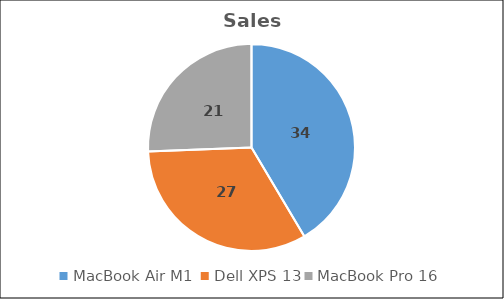
| Category | Sales Quantity |
|---|---|
| MacBook Air M1  | 34 |
| Dell XPS 13 | 27 |
| MacBook Pro 16 | 21 |